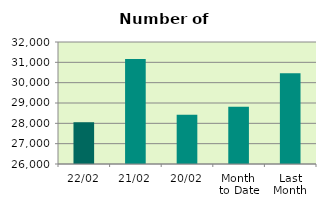
| Category | Series 0 |
|---|---|
| 22/02 | 28054 |
| 21/02 | 31170 |
| 20/02 | 28416 |
| Month 
to Date | 28813 |
| Last
Month | 30462.455 |